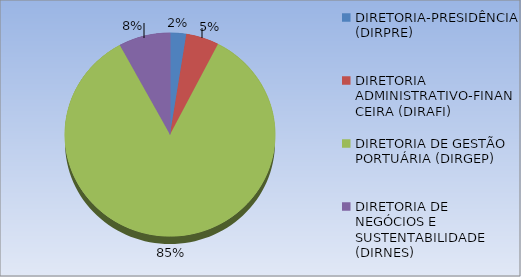
| Category | Series 0 |
|---|---|
| DIRETORIA-PRESIDÊNCIA (DIRPRE) | 4215000 |
| DIRETORIA ADMINISTRATIVO-FINANCEIRA (DIRAFI) | 8571578.1 |
| DIRETORIA DE GESTÃO PORTUÁRIA (DIRGEP) | 143596325.82 |
| DIRETORIA DE NEGÓCIOS E SUSTENTABILIDADE (DIRNES) | 13445515.58 |